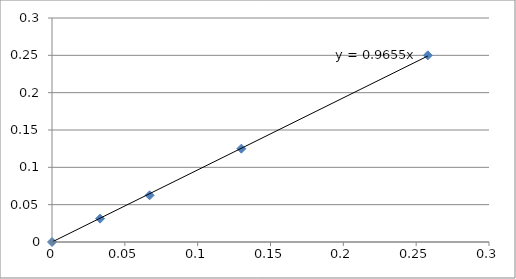
| Category | Series 0 |
|---|---|
| 0.0 | 0 |
| 0.033 | 0.031 |
| 0.067 | 0.062 |
| 0.13 | 0.125 |
| 0.258 | 0.25 |